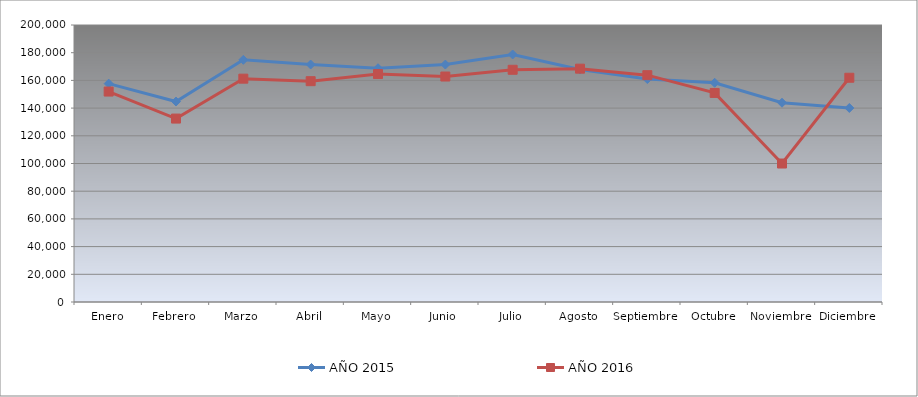
| Category | AÑO 2015 | AÑO 2016 |
|---|---|---|
| Enero | 157652.807 | 151951.055 |
| Febrero | 144726.427 | 132438.758 |
| Marzo | 174849.351 | 161247.958 |
| Abril | 171461.474 | 159433.881 |
| Mayo | 168781.484 | 164578.635 |
| Junio | 171437.952 | 162799.126 |
| Julio | 178715.438 | 167670.744 |
| Agosto | 167879.312 | 168470.845 |
| Septiembre | 160955.008 | 163774.223 |
| Octubre | 158292.599 | 150958.653 |
| Noviembre | 143868.263 | 99984.704 |
| Diciembre | 140101.731 | 161913.745 |